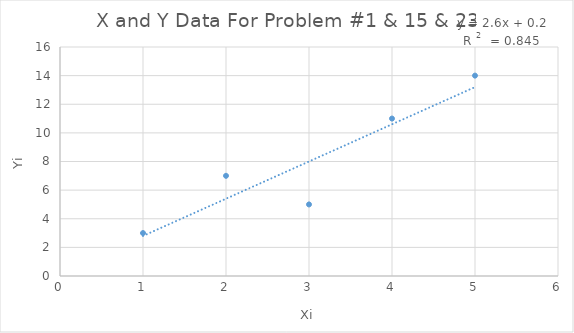
| Category | Yi |
|---|---|
| 1.0 | 3 |
| 2.0 | 7 |
| 3.0 | 5 |
| 4.0 | 11 |
| 5.0 | 14 |